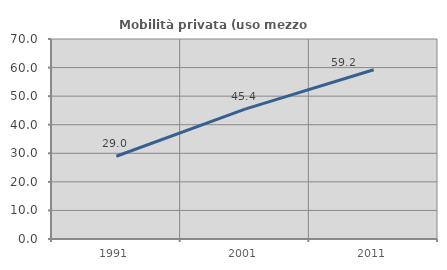
| Category | Mobilità privata (uso mezzo privato) |
|---|---|
| 1991.0 | 28.954 |
| 2001.0 | 45.435 |
| 2011.0 | 59.217 |